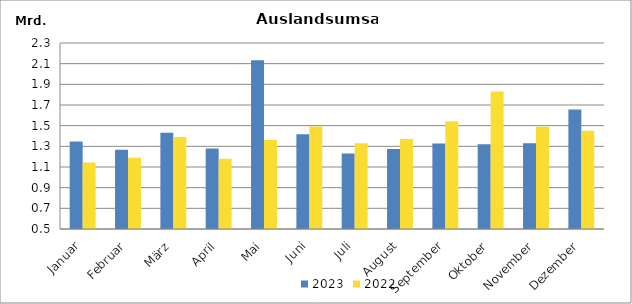
| Category | 2023 | 2022 |
|---|---|---|
| Januar | 1346815.404 | 1142453.019 |
| Februar | 1266972.511 | 1188814.277 |
| März | 1430721.642 | 1390637.701 |
| April | 1278576.834 | 1179830.015 |
| Mai | 2132236.376 | 1360986.685 |
| Juni | 1416683.832 | 1490997.424 |
| Juli | 1230408.904 | 1329189.732 |
| August | 1275214.271 | 1371065.503 |
| September | 1328467.261 | 1543388.179 |
| Oktober | 1320861.98 | 1829745.827 |
| November | 1330637.817 | 1489902.879 |
| Dezember | 1657500.055 | 1451454.728 |